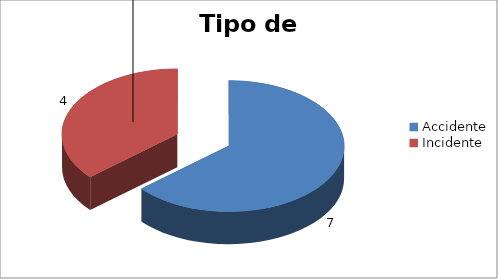
| Category | Tipo de suceso |
|---|---|
| Accidente | 7 |
| Incidente | 4 |